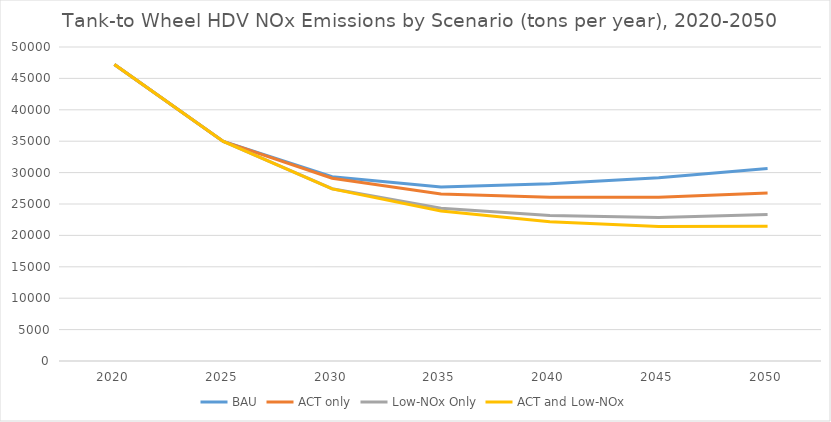
| Category | BAU | ACT only | Low-NOx Only | ACT and Low-NOx |
|---|---|---|---|---|
| 2020.0 | 47219.869 | 47219.869 | 47219.869 | 47219.869 |
| 2025.0 | 34959.456 | 34959.456 | 34959.456 | 34959.456 |
| 2030.0 | 29332.145 | 29095.352 | 27436.878 | 27399.621 |
| 2035.0 | 27720.451 | 26598.655 | 24332.052 | 23879.985 |
| 2040.0 | 28241.911 | 26090.505 | 23151.203 | 22191.195 |
| 2045.0 | 29187.392 | 26085.695 | 22856.811 | 21401.146 |
| 2050.0 | 30661.89 | 26758.834 | 23328.015 | 21455.44 |